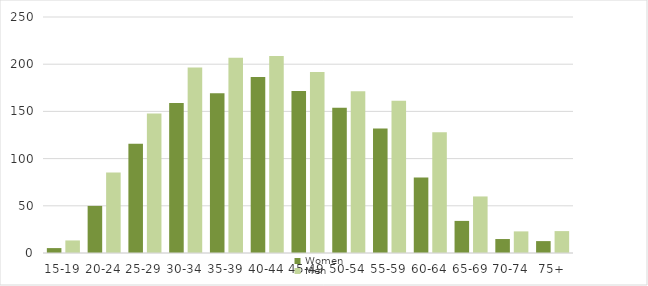
| Category | Women | Men |
|---|---|---|
| 15-19 | 5.2 | 13.3 |
| 20-24 | 49.9 | 85.3 |
| 25-29 | 115.7 | 147.8 |
| 30-34 | 159 | 196.4 |
| 35-39 | 169.1 | 206.9 |
| 40-44 | 186.4 | 208.6 |
| 45-49 | 171.7 | 191.7 |
| 50-54 | 153.9 | 171.3 |
| 55-59 | 131.9 | 161.4 |
| 60-64 | 80.1 | 127.8 |
| 65-69 | 34 | 59.9 |
| 70-74 | 14.8 | 22.9 |
| 75+ | 12.6 | 23.2 |